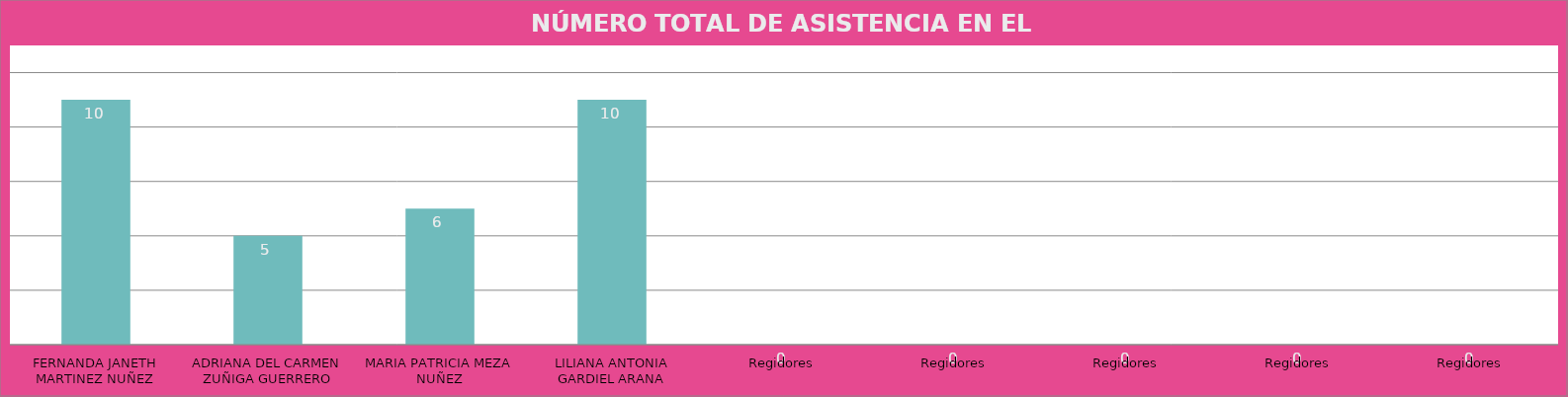
| Category | FERNANDA JANETH MARTINEZ NUÑEZ |
|---|---|
| FERNANDA JANETH MARTINEZ NUÑEZ | 10 |
| ADRIANA DEL CARMEN ZUÑIGA GUERRERO | 5 |
| MARIA PATRICIA MEZA NUÑEZ | 6 |
| LILIANA ANTONIA GARDIEL ARANA | 10 |
| Regidores | 0 |
| Regidores | 0 |
| Regidores | 0 |
| Regidores | 0 |
| Regidores | 0 |